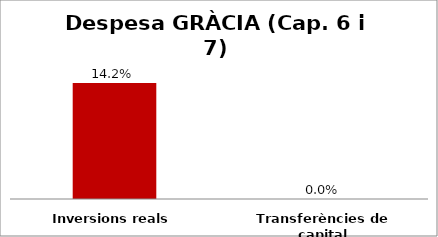
| Category | Series 0 |
|---|---|
| Inversions reals | 0.142 |
| Transferències de capital | 0 |